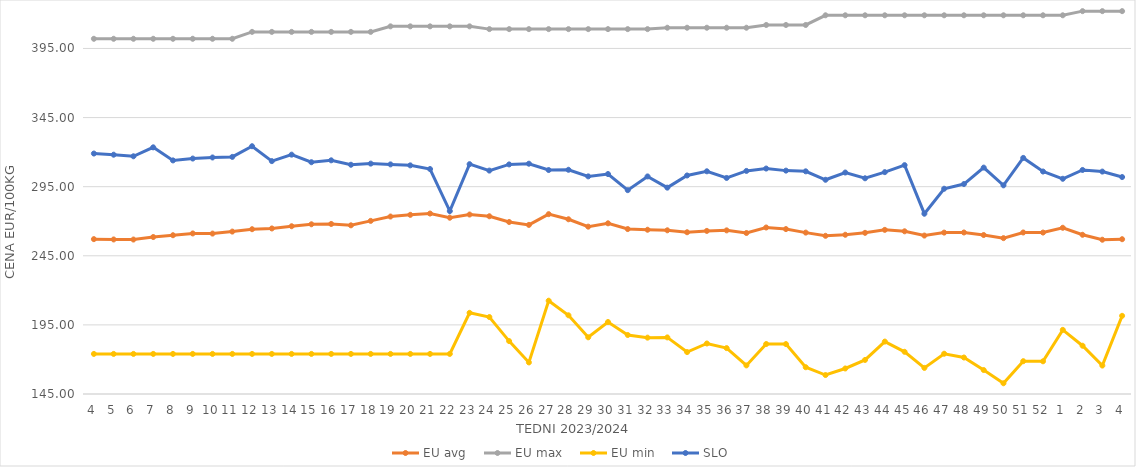
| Category | EU avg | EU max | EU min | SLO |
|---|---|---|---|---|
| 4.0 | 257.051 | 402 | 174 | 318.98 |
| 5.0 | 256.808 | 402 | 174 | 318.13 |
| 6.0 | 256.75 | 402 | 174 | 316.99 |
| 7.0 | 258.565 | 402 | 174 | 323.47 |
| 8.0 | 259.872 | 402 | 174 | 314 |
| 9.0 | 261.164 | 402 | 174 | 315.35 |
| 10.0 | 261.06 | 402 | 174 | 316.13 |
| 11.0 | 262.513 | 402 | 174 | 316.55 |
| 12.0 | 264.228 | 407 | 174 | 324.27 |
| 13.0 | 264.768 | 407 | 174 | 313.49 |
| 14.0 | 266.385 | 407 | 174 | 318.17 |
| 15.0 | 267.797 | 407 | 174 | 312.7 |
| 16.0 | 268.021 | 407 | 174 | 314.07 |
| 17.0 | 267.041 | 407 | 174 | 310.87 |
| 18.0 | 270.255 | 407 | 174 | 311.69 |
| 19.0 | 273.406 | 411 | 174 | 311.13 |
| 20.0 | 274.631 | 411 | 174 | 310.42 |
| 21.0 | 275.561 | 411 | 174 | 307.76 |
| 22.0 | 272.542 | 411 | 174 | 277.34 |
| 23.0 | 274.85 | 411 | 203.728 | 311.28 |
| 24.0 | 273.59 | 409 | 200.686 | 306.64 |
| 25.0 | 269.439 | 409 | 183.275 | 311.1 |
| 26.0 | 267.345 | 409 | 167.858 | 311.62 |
| 27.0 | 275.123 | 409 | 212.506 | 307.04 |
| 28.0 | 271.42 | 409 | 201.945 | 307.23 |
| 29.0 | 266.08 | 409 | 186.018 | 302.45 |
| 30.0 | 268.49 | 409 | 197.093 | 304.14 |
| 31.0 | 264.334 | 409 | 187.684 | 292.49 |
| 32.0 | 263.844 | 409 | 185.774 | 302.41 |
| 33.0 | 263.441 | 410 | 185.951 | 294.3 |
| 34.0 | 262.028 | 410 | 175.332 | 303.1 |
| 35.0 | 262.997 | 410 | 181.543 | 306.13 |
| 36.0 | 263.389 | 410 | 178.207 | 301.32 |
| 37.0 | 261.486 | 410 | 165.697 | 306.4 |
| 38.0 | 265.47 | 412 | 181.159 | 308.12 |
| 39.0 | 264.316 | 412 | 181.124 | 306.62 |
| 40.0 | 261.774 | 412 | 164.37 | 306.1 |
| 41.0 | 259.456 | 419 | 158.728 | 300 |
| 42.0 | 260.21 | 419 | 163.464 | 305.24 |
| 43.0 | 261.605 | 419 | 169.66 | 301.07 |
| 44.0 | 263.758 | 419 | 182.925 | 305.52 |
| 45.0 | 262.714 | 419 | 175.524 | 310.58 |
| 46.0 | 259.625 | 419 | 163.882 | 275.46 |
| 47.0 | 261.772 | 419 | 174.136 | 293.51 |
| 48.0 | 261.864 | 419 | 171.4 | 296.9 |
| 49.0 | 260.014 | 419 | 162.336 | 308.8 |
| 50.0 | 257.768 | 419 | 152.762 | 295.97 |
| 51.0 | 261.869 | 419 | 168.739 | 315.82 |
| 52.0 | 261.805 | 419 | 168.659 | 305.97 |
| 1.0 | 265.269 | 419 | 191.406 | 300.71 |
| 2.0 | 260.192 | 422 | 179.926 | 307.09 |
| 3.0 | 256.616 | 422 | 165.575 | 305.92 |
| 4.0 | 256.992 | 422 | 201.56 | 301.97 |